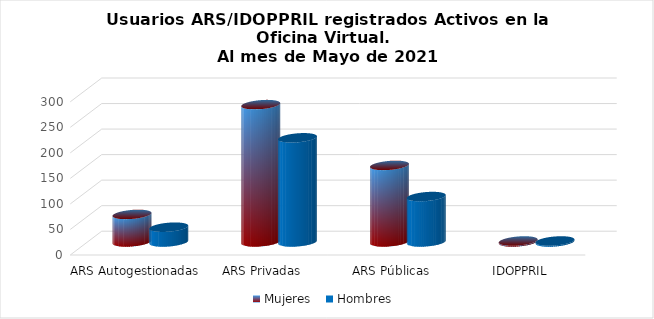
| Category | Mujeres | Hombres |
|---|---|---|
| ARS Autogestionadas | 54 | 29 |
| ARS Privadas | 269 | 204 |
| ARS Públicas | 150 | 89 |
| IDOPPRIL | 2 | 2 |